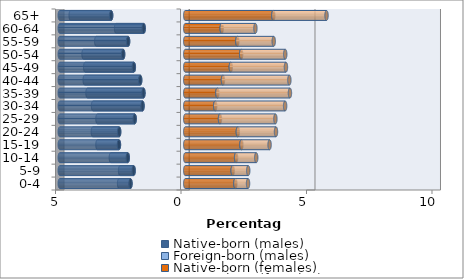
| Category | Native-born (males) | Foreign-born (males) | Native-born (females) | Foreign-born (females) |
|---|---|---|---|---|
| 0-4 | -2.182 | -0.454 | 1.996 | 0.506 |
| 5-9 | -2.057 | -0.54 | 1.89 | 0.62 |
| 10-14 | -2.29 | -0.674 | 2.025 | 0.803 |
| 15-19 | -2.642 | -0.856 | 2.237 | 1.123 |
| 20-24 | -2.633 | -1.048 | 2.096 | 1.52 |
| 25-29 | -2.015 | -1.483 | 1.384 | 2.208 |
| 30-34 | -1.703 | -1.971 | 1.193 | 2.786 |
| 35-39 | -1.665 | -2.23 | 1.279 | 2.892 |
| 40-44 | -1.795 | -2.211 | 1.502 | 2.646 |
| 45-49 | -2.048 | -1.938 | 1.815 | 2.197 |
| 50-54 | -2.475 | -1.577 | 2.228 | 1.756 |
| 55-59 | -2.277 | -1.269 | 2.074 | 1.45 |
| 60-64 | -1.656 | -1.098 | 1.452 | 1.343 |
| 65+ | -2.953 | -1.612 | 3.509 | 2.12 |